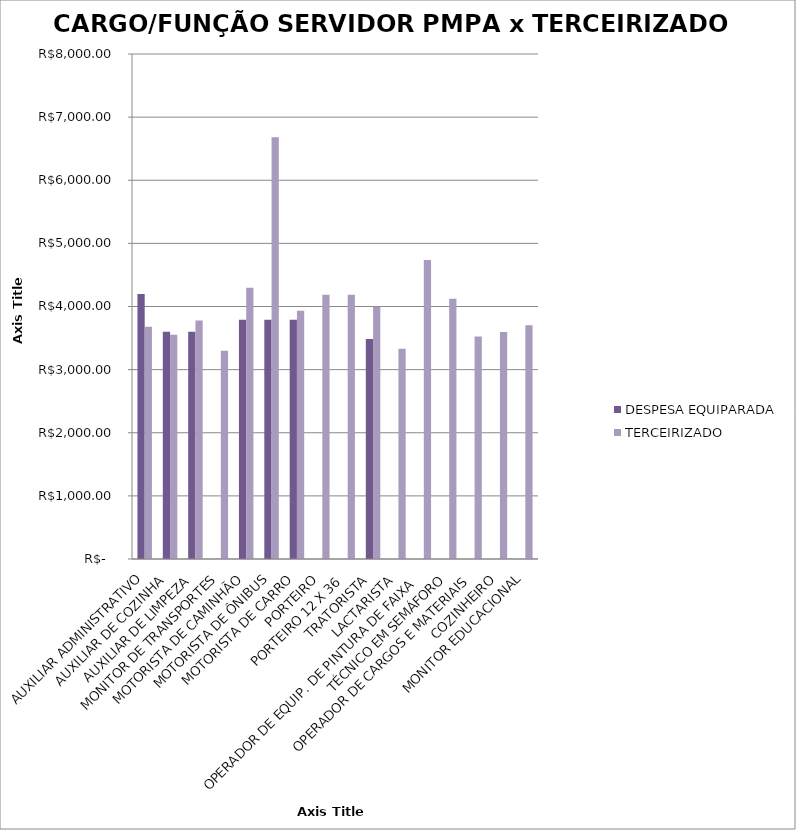
| Category | DESPESA EQUIPARADA | TERCEIRIZADO |
|---|---|---|
| AUXILIAR ADMINISTRATIVO | 4196.283 | 3677.59 |
| AUXILIAR DE COZINHA | 3598.96 | 3551.18 |
| AUXILIAR DE LIMPEZA | 3598.96 | 3777.25 |
| MONITOR DE TRANSPORTES | 0 | 3300.94 |
| MOTORISTA DE CAMINHÃO | 3789.031 | 4295.46 |
| MOTORISTA DE ÔNIBUS | 3789.031 | 6680.07 |
| MOTORISTA DE CARRO | 3789.031 | 3933.47 |
| PORTEIRO | 0 | 4185.48 |
| PORTEIRO 12 X 36 | 0 | 4185.48 |
| TRATORISTA | 3485.02 | 3995.07 |
| LACTARISTA | 0 | 3330.92 |
| OPERADOR DE EQUIP. DE PINTURA DE FAIXA | 0 | 4734.89 |
| TÉCNICO EM SEMÁFORO | 0 | 4122.88 |
| OPERADOR DE CARGOS E MATERIAIS | 0 | 3525.84 |
| COZINHEIRO | 0 | 3595.85 |
| MONITOR EDUCACIONAL | 0 | 3701.84 |